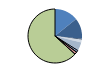
| Category | Series 0 |
|---|---|
| ARRASTRE | 121 |
| CERCO | 106 |
| ATUNEROS CAÑEROS | 5 |
| PALANGRE DE FONDO | 14 |
| PALANGRE DE SUPERFICIE | 39 |
| RASCO | 5 |
| VOLANTA | 10 |
| ARTES FIJAS | 13 |
| ARTES MENORES | 539 |